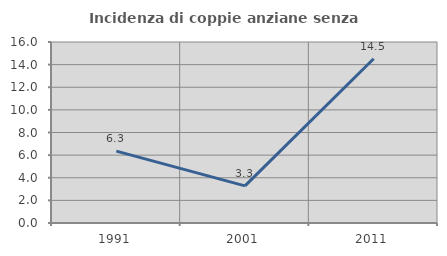
| Category | Incidenza di coppie anziane senza figli  |
|---|---|
| 1991.0 | 6.349 |
| 2001.0 | 3.279 |
| 2011.0 | 14.516 |